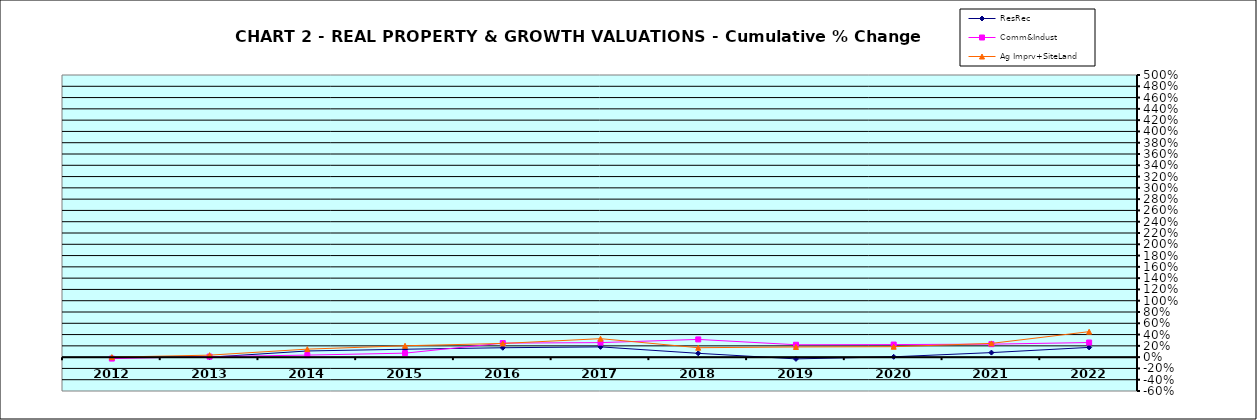
| Category | ResRec | Comm&Indust | Ag Imprv+SiteLand |
|---|---|---|---|
| 2012.0 | -0.005 | -0.025 | 0 |
| 2013.0 | -0.001 | 0.009 | 0.035 |
| 2014.0 | 0.109 | 0.036 | 0.142 |
| 2015.0 | 0.14 | 0.071 | 0.202 |
| 2016.0 | 0.166 | 0.249 | 0.242 |
| 2017.0 | 0.182 | 0.257 | 0.328 |
| 2018.0 | 0.068 | 0.314 | 0.167 |
| 2019.0 | -0.031 | 0.22 | 0.181 |
| 2020.0 | 0.006 | 0.223 | 0.185 |
| 2021.0 | 0.081 | 0.23 | 0.244 |
| 2022.0 | 0.173 | 0.259 | 0.451 |